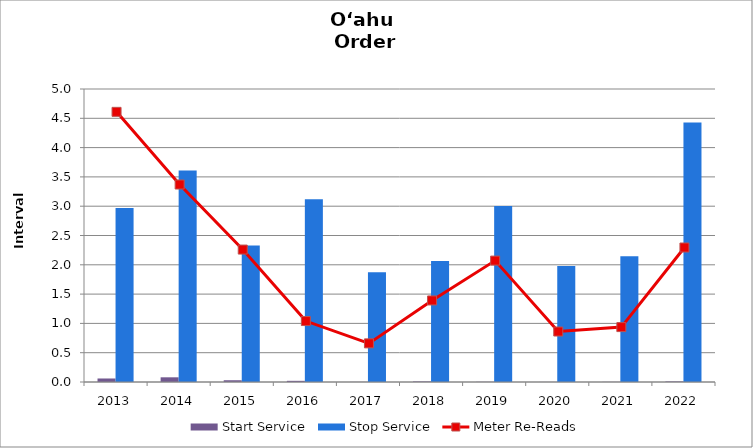
| Category | Start Service | Stop Service |
|---|---|---|
| 2013.0 | 0.06 | 2.97 |
| 2014.0 | 0.08 | 3.611 |
| 2015.0 | 0.03 | 2.33 |
| 2016.0 | 0.02 | 3.12 |
| 2017.0 | 0.002 | 1.875 |
| 2018.0 | 0.009 | 2.065 |
| 2019.0 | 0.003 | 3.004 |
| 2020.0 | 0.001 | 1.98 |
| 2021.0 | 0.002 | 2.147 |
| 2022.0 | 0.009 | 4.43 |